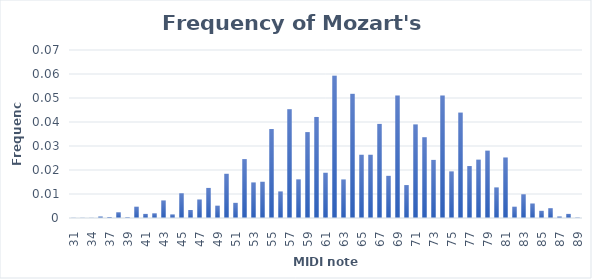
| Category | Series 0 |
|---|---|
| 31.0 | 0 |
| 32.0 | 0 |
| 34.0 | 0 |
| 36.0 | 0.001 |
| 37.0 | 0 |
| 38.0 | 0.002 |
| 39.0 | 0 |
| 40.0 | 0.005 |
| 41.0 | 0.002 |
| 42.0 | 0.002 |
| 43.0 | 0.007 |
| 44.0 | 0.001 |
| 45.0 | 0.01 |
| 46.0 | 0.003 |
| 47.0 | 0.008 |
| 48.0 | 0.013 |
| 49.0 | 0.005 |
| 50.0 | 0.018 |
| 51.0 | 0.006 |
| 52.0 | 0.025 |
| 53.0 | 0.015 |
| 54.0 | 0.015 |
| 55.0 | 0.037 |
| 56.0 | 0.011 |
| 57.0 | 0.045 |
| 58.0 | 0.016 |
| 59.0 | 0.036 |
| 60.0 | 0.042 |
| 61.0 | 0.019 |
| 62.0 | 0.059 |
| 63.0 | 0.016 |
| 64.0 | 0.052 |
| 65.0 | 0.026 |
| 66.0 | 0.026 |
| 67.0 | 0.039 |
| 68.0 | 0.018 |
| 69.0 | 0.051 |
| 70.0 | 0.014 |
| 71.0 | 0.039 |
| 72.0 | 0.034 |
| 73.0 | 0.024 |
| 74.0 | 0.051 |
| 75.0 | 0.019 |
| 76.0 | 0.044 |
| 77.0 | 0.022 |
| 78.0 | 0.024 |
| 79.0 | 0.028 |
| 80.0 | 0.013 |
| 81.0 | 0.025 |
| 82.0 | 0.005 |
| 83.0 | 0.01 |
| 84.0 | 0.006 |
| 85.0 | 0.003 |
| 86.0 | 0.004 |
| 87.0 | 0.001 |
| 88.0 | 0.002 |
| 89.0 | 0 |